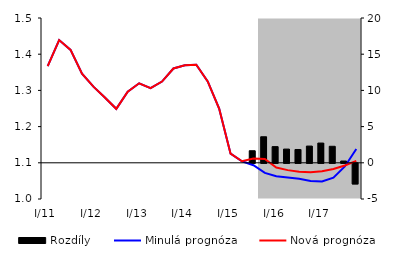
| Category | Rozdíly |
|---|---|
| 0 | 0 |
| 1 | 0 |
| 2 | 0 |
| 3 | 0 |
| 4 | 0 |
| 5 | 0 |
| 6 | 0 |
| 7 | 0 |
| 8 | 0 |
| 9 | 0 |
| 10 | 0 |
| 11 | 0 |
| 12 | 0 |
| 13 | 0 |
| 14 | 0 |
| 15 | 0 |
| 16 | 0 |
| 17 | 0 |
| 18 | 1.668 |
| 19 | 3.596 |
| 20 | 2.236 |
| 21 | 1.894 |
| 22 | 1.838 |
| 23 | 2.311 |
| 24 | 2.728 |
| 25 | 2.281 |
| 26 | 0.245 |
| 27 | -2.85 |